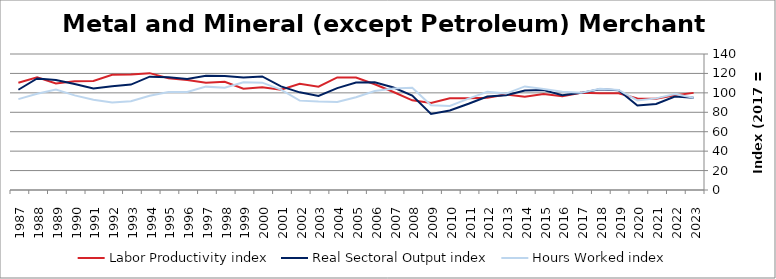
| Category | Labor Productivity index | Real Sectoral Output index | Hours Worked index |
|---|---|---|---|
| 2023.0 | 99.983 | 94.946 | 94.963 |
| 2022.0 | 97.436 | 96.213 | 98.745 |
| 2021.0 | 93.826 | 88.488 | 94.311 |
| 2020.0 | 94.304 | 86.983 | 92.236 |
| 2019.0 | 99.618 | 102.656 | 103.05 |
| 2018.0 | 99.606 | 103.739 | 104.149 |
| 2017.0 | 100 | 100 | 100 |
| 2016.0 | 96.443 | 97.642 | 101.243 |
| 2015.0 | 98.873 | 102.903 | 104.076 |
| 2014.0 | 96.081 | 102.453 | 106.632 |
| 2013.0 | 98.303 | 97.58 | 99.264 |
| 2012.0 | 95.077 | 96.168 | 101.147 |
| 2011.0 | 94.369 | 88.758 | 94.054 |
| 2010.0 | 94.539 | 81.841 | 86.568 |
| 2009.0 | 89.651 | 78.267 | 87.302 |
| 2008.0 | 92.336 | 97.288 | 105.363 |
| 2007.0 | 100.9 | 105.466 | 104.525 |
| 2006.0 | 108.875 | 110.993 | 101.945 |
| 2005.0 | 115.85 | 110.65 | 95.512 |
| 2004.0 | 115.859 | 104.902 | 90.542 |
| 2003.0 | 106.396 | 96.834 | 91.013 |
| 2002.0 | 109.262 | 100.52 | 92 |
| 2001.0 | 103.313 | 106.69 | 103.268 |
| 2000.0 | 105.796 | 116.877 | 110.473 |
| 1999.0 | 104.252 | 115.715 | 110.995 |
| 1998.0 | 111.462 | 117.264 | 105.205 |
| 1997.0 | 110.415 | 117.492 | 106.41 |
| 1996.0 | 113.187 | 114.227 | 100.919 |
| 1995.0 | 115.133 | 116.09 | 100.831 |
| 1994.0 | 120.284 | 116.664 | 96.991 |
| 1993.0 | 118.829 | 108.522 | 91.326 |
| 1992.0 | 118.575 | 106.694 | 89.98 |
| 1991.0 | 112.316 | 104.436 | 92.984 |
| 1990.0 | 112.062 | 109.173 | 97.422 |
| 1989.0 | 109.642 | 113.334 | 103.367 |
| 1988.0 | 116.03 | 114.869 | 98.999 |
| 1987.0 | 110.348 | 103.205 | 93.526 |